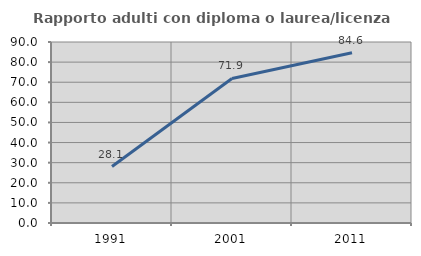
| Category | Rapporto adulti con diploma o laurea/licenza media  |
|---|---|
| 1991.0 | 28.07 |
| 2001.0 | 71.875 |
| 2011.0 | 84.615 |